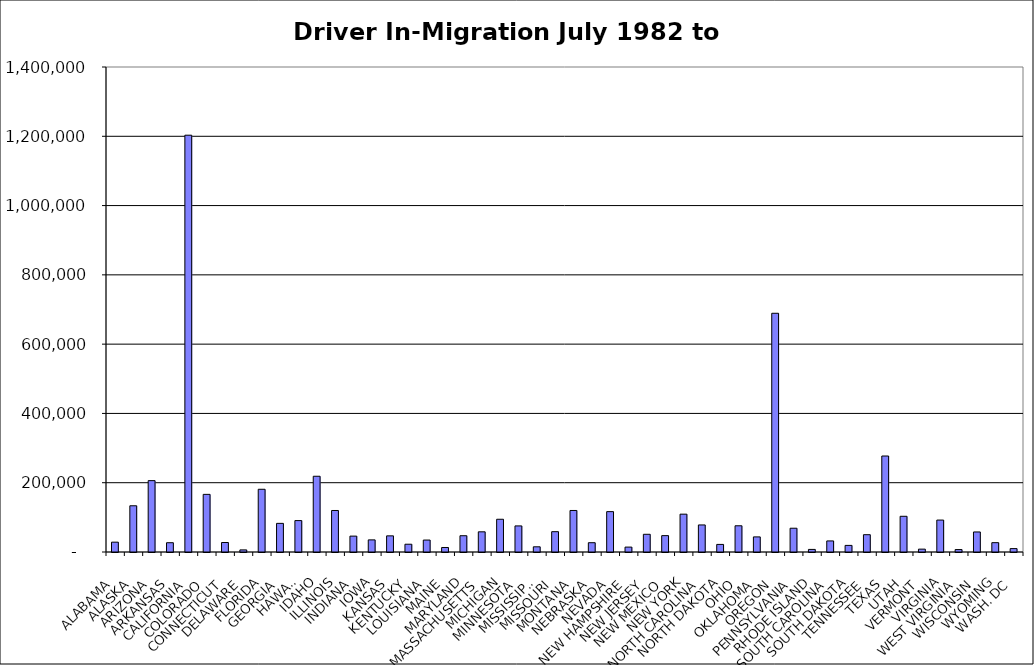
| Category | Series 0 |
|---|---|
| ALABAMA | 28372.5 |
| ALASKA | 133428.5 |
| ARIZONA | 206019 |
| ARKANSAS | 26800.5 |
| CALIFORNIA | 1203150.5 |
| COLORADO | 166363 |
| CONNECTICUT | 27406 |
| DELAWARE | 6066.5 |
| FLORIDA | 181061 |
| GEORGIA | 82651 |
| HAWAII | 90696.5 |
| IDAHO | 218631.5 |
| ILLINOIS | 119794.5 |
| INDIANA | 45853 |
| IOWA | 34972.5 |
| KANSAS | 46620.5 |
| KENTUCKY | 22419 |
| LOUISIANA | 34487.5 |
| MAINE | 13001.5 |
| MARYLAND | 46964 |
| MASSACHUSETTS | 58272 |
| MICHIGAN | 94493 |
| MINNESOTA | 75277.5 |
| MISSISSIPPI | 15006 |
| MISSOURI | 58666 |
| MONTANA | 119842 |
| NEBRASKA | 26800.5 |
| NEVADA | 116517 |
| NEW HAMPSHIRE | 14145.5 |
| NEW JERSEY | 51123 |
| NEW MEXICO | 47266 |
| NEW YORK | 109212 |
| NORTH CAROLINA | 78084.5 |
| NORTH DAKOTA | 21917.5 |
| OHIO | 75703.5 |
| OKLAHOMA | 43570 |
| OREGON | 689087 |
| PENNSYLVANIA | 68619.5 |
| RHODE ISLAND | 7447 |
| SOUTH CAROLINA | 31947.5 |
| SOUTH DAKOTA | 19052.5 |
| TENNESSEE | 49965.5 |
| TEXAS | 277099 |
| UTAH | 103080.5 |
| VERMONT | 8296 |
| VIRGINIA | 92165 |
| WEST VIRGINIA | 7015.5 |
| WISCONSIN | 57858.5 |
| WYOMING | 26961 |
| WASH. DC | 9790 |